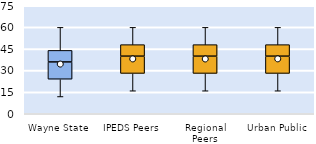
| Category | 25th | 50th | 75th |
|---|---|---|---|
| Wayne State | 24 | 12 | 8 |
| IPEDS Peers | 28 | 12 | 8 |
| Regional Peers | 28 | 12 | 8 |
| Urban Public | 28 | 12 | 8 |